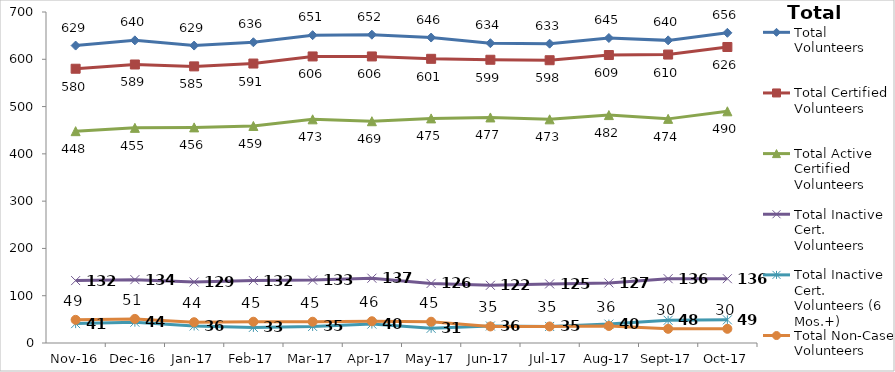
| Category | Total Volunteers | Total Certified Volunteers | Total Active Certified Volunteers | Total Inactive Cert. Volunteers | Total Inactive Cert. Volunteers (6 Mos.+) | Total Non-Case Volunteers |
|---|---|---|---|---|---|---|
| 2016-11-01 | 629 | 580 | 448 | 132 | 41 | 49 |
| 2016-12-01 | 640 | 589 | 455 | 134 | 44 | 51 |
| 2017-01-01 | 629 | 585 | 456 | 129 | 36 | 44 |
| 2017-02-01 | 636 | 591 | 459 | 132 | 33 | 45 |
| 2017-03-01 | 651 | 606 | 473 | 133 | 35 | 45 |
| 2017-04-01 | 652 | 606 | 469 | 137 | 40 | 46 |
| 2017-05-01 | 646 | 601 | 475 | 126 | 31 | 45 |
| 2017-06-01 | 634 | 599 | 477 | 122 | 36 | 35 |
| 2017-07-01 | 633 | 598 | 473 | 125 | 35 | 35 |
| 2017-08-01 | 645 | 609 | 482 | 127 | 40 | 36 |
| 2017-09-01 | 640 | 610 | 474 | 136 | 48 | 30 |
| 2017-10-01 | 656 | 626 | 490 | 136 | 49 | 30 |